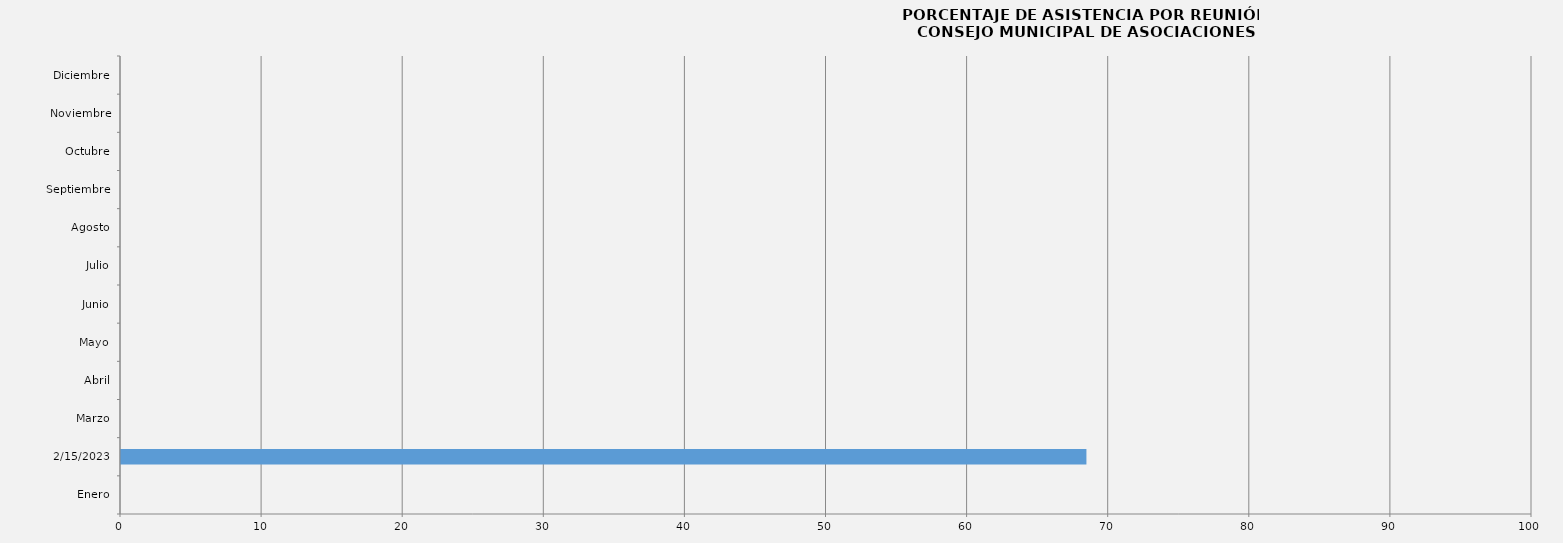
| Category | Enero |
|---|---|
| Enero | 0 |
| 15/02/2023 | 68.421 |
| Marzo | 0 |
| Abril | 0 |
| Mayo | 0 |
| Junio | 0 |
| Julio | 0 |
| Agosto | 0 |
| Septiembre | 0 |
| Octubre | 0 |
| Noviembre | 0 |
| Diciembre | 0 |